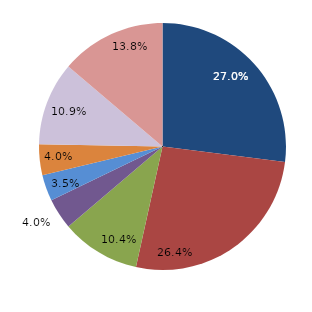
| Category | Series 0 |
|---|---|
| قبل الدخول
Before Consummation | 27.011 |
| -1 | 26.437 |
| 1 | 10.345 |
| 2 | 4.023 |
| 3 | 3.448 |
| 4 | 4.023 |
|  5 - 9 | 10.92 |
| 10+ | 13.793 |